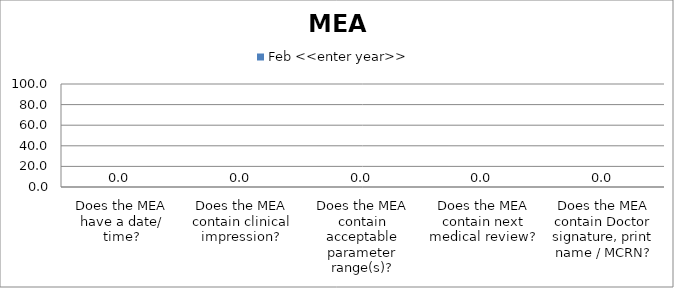
| Category | Feb <<enter year>> |
|---|---|
| Does the MEA have a date/ time? | 0 |
| Does the MEA contain clinical impression? | 0 |
| Does the MEA contain acceptable parameter range(s)? | 0 |
| Does the MEA contain next medical review? | 0 |
| Does the MEA contain Doctor signature, print name / MCRN? | 0 |